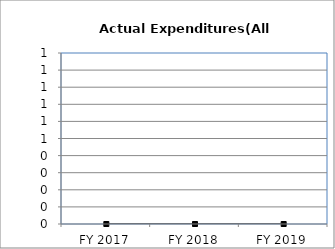
| Category | Actual Expenditures(All Funds) |
|---|---|
| FY 2017 | 0 |
| FY 2018 | 0 |
| FY 2019 | 0 |